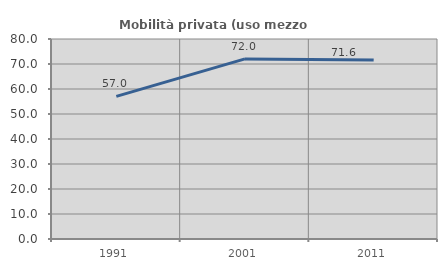
| Category | Mobilità privata (uso mezzo privato) |
|---|---|
| 1991.0 | 57.05 |
| 2001.0 | 72.05 |
| 2011.0 | 71.643 |